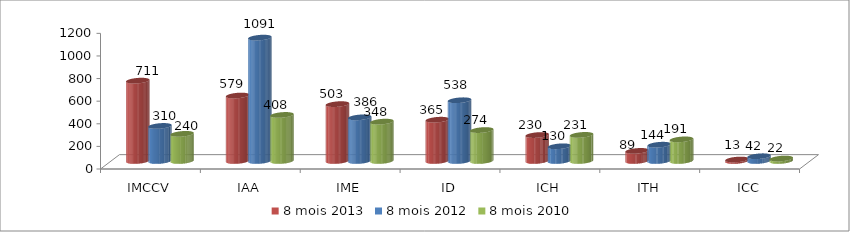
| Category | 8 mois 2013 | 8 mois 2012 | 8 mois 2010 |
|---|---|---|---|
| IMCCV | 710.8 | 310.1 | 240.1 |
| IAA | 579.2 | 1091.4 | 407.5 |
| IME | 503.2 | 386.2 | 348.2 |
| ID | 365.3 | 537.5 | 273.7 |
| ICH | 229.7 | 130.1 | 231 |
| ITH | 89.4 | 144.1 | 191.3 |
| ICC | 13 | 42.1 | 21.6 |